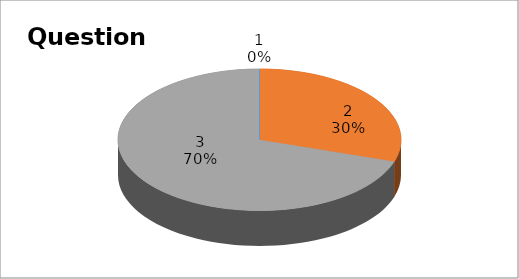
| Category | Series 0 |
|---|---|
| 0 | 0 |
| 1 | 3 |
| 2 | 7 |